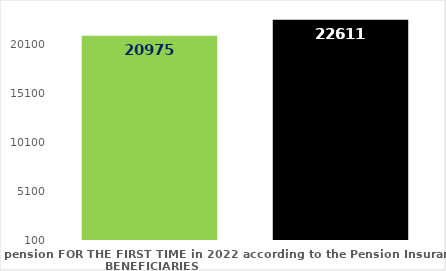
| Category | broj korisnika |
|---|---|
| Pension beneficiaries entitled to pension FOR THE FIRST TIME in 2022 according to the Pension Insurance Act  - NEW BENEFICIARIES | 20975 |
| Pension beneficiaries whose pension entitlement ceased in 2022  -  death caused,   
and who were retired according to the Pension Insurance Act   | 22611 |